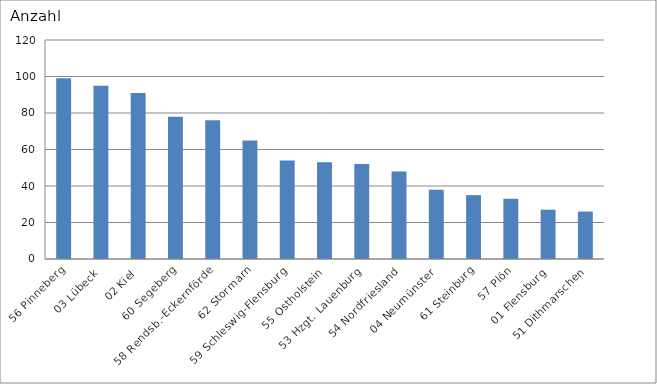
| Category | 56 Pinneberg 03 Lübeck 02 Kiel 60 Segeberg 58 Rendsb.-Eckernförde 62 Stormarn 59 Schleswig-Flensburg 55 Ostholstein 53 Hzgt. Lauenburg 54 Nordfriesland 04 Neumünster 61 Steinburg 57 Plön 01 Flensburg 51 Dithmarschen |
|---|---|
| 56 Pinneberg | 99 |
| 03 Lübeck | 95 |
| 02 Kiel | 91 |
| 60 Segeberg | 78 |
| 58 Rendsb.-Eckernförde | 76 |
| 62 Stormarn | 65 |
| 59 Schleswig-Flensburg | 54 |
| 55 Ostholstein | 53 |
| 53 Hzgt. Lauenburg | 52 |
| 54 Nordfriesland | 48 |
| 04 Neumünster | 38 |
| 61 Steinburg | 35 |
| 57 Plön | 33 |
| 01 Flensburg | 27 |
| 51 Dithmarschen | 26 |